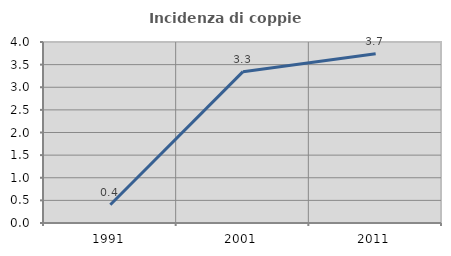
| Category | Incidenza di coppie miste |
|---|---|
| 1991.0 | 0.404 |
| 2001.0 | 3.344 |
| 2011.0 | 3.742 |